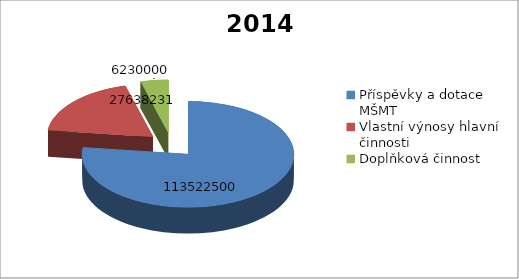
| Category | 2014 |
|---|---|
| Příspěvky a dotace MŠMT | 113522500 |
| Vlastní výnosy hlavní činnosti | 27638231 |
| Doplňková činnost | 6230000 |